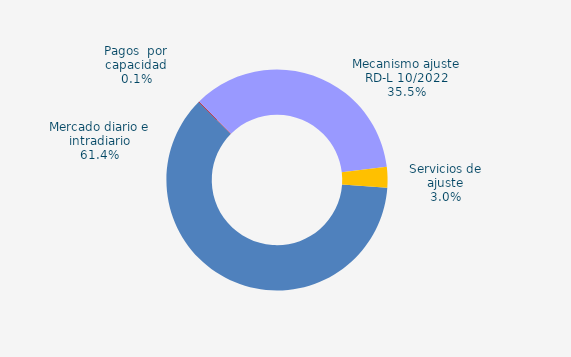
| Category | Series 0 |
|---|---|
| Mercado diario e intradiario | 154.58 |
| Pagos  por capacidad | 0.25 |
| Mecanismo ajuste RD-L 10/2022 | 89.53 |
| Servicios de ajuste | 7.58 |